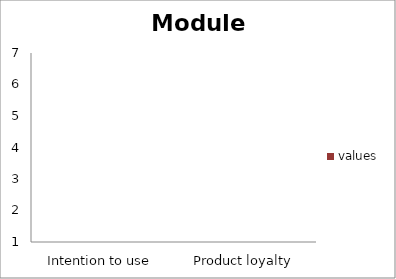
| Category | values |
|---|---|
| Intention to use | 0 |
| Product loyalty | 0 |